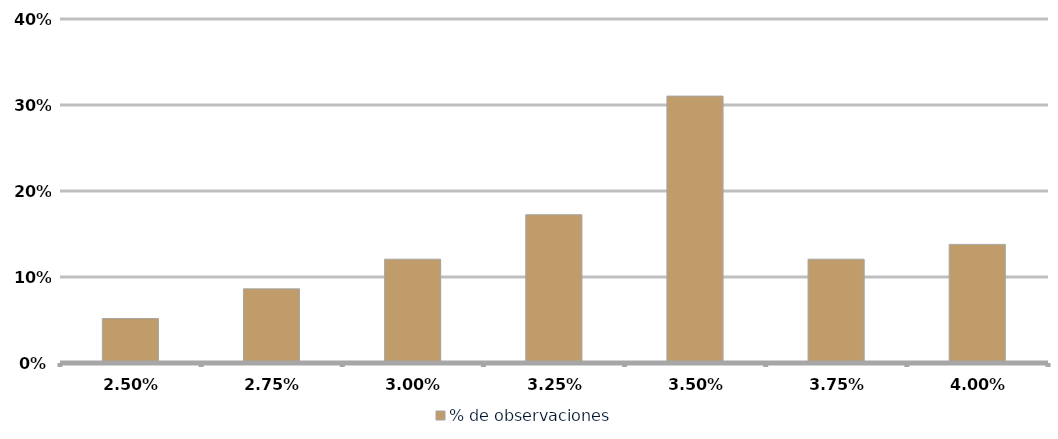
| Category | % de observaciones  |
|---|---|
| 0.025000000000000005 | 0.052 |
| 0.027500000000000004 | 0.086 |
| 0.030000000000000002 | 0.121 |
| 0.0325 | 0.172 |
| 0.035 | 0.31 |
| 0.037500000000000006 | 0.121 |
| 0.04000000000000001 | 0.138 |